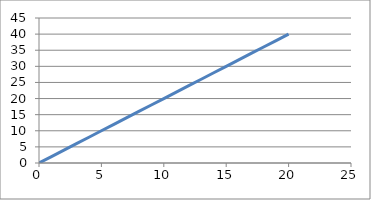
| Category | variable |
|---|---|
| 0.0 | 0 |
| 1.0 | 2 |
| 2.0 | 4 |
| 3.0 | 6 |
| 4.0 | 8 |
| 5.0 | 10 |
| 6.0 | 12 |
| 7.0 | 14 |
| 8.0 | 16 |
| 9.0 | 18 |
| 10.0 | 20 |
| 11.0 | 22 |
| 12.0 | 24 |
| 13.0 | 26 |
| 14.0 | 28 |
| 15.0 | 30 |
| 16.0 | 32 |
| 17.0 | 34 |
| 18.0 | 36 |
| 19.0 | 38 |
| 20.0 | 40 |